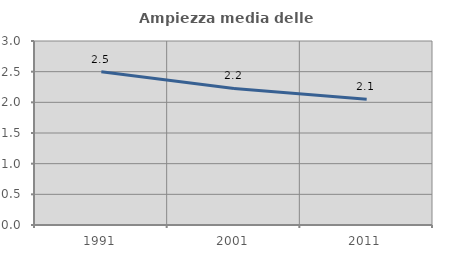
| Category | Ampiezza media delle famiglie |
|---|---|
| 1991.0 | 2.497 |
| 2001.0 | 2.226 |
| 2011.0 | 2.052 |